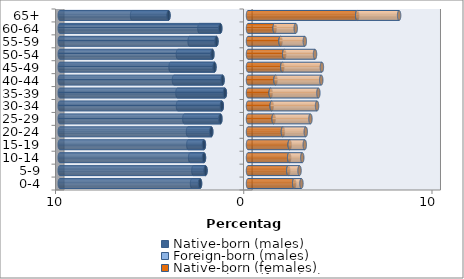
| Category | Native-born (males) | Foreign-born (males) | Native-born (females) | Foreign-born (females) |
|---|---|---|---|---|
| 0-4 | -2.547 | -0.426 | 2.454 | 0.385 |
| 5-9 | -2.257 | -0.645 | 2.139 | 0.597 |
| 10-14 | -2.339 | -0.735 | 2.186 | 0.697 |
| 15-19 | -2.342 | -0.828 | 2.214 | 0.801 |
| 20-24 | -1.952 | -1.236 | 1.855 | 1.214 |
| 25-29 | -1.467 | -1.916 | 1.361 | 1.956 |
| 30-34 | -1.39 | -2.331 | 1.258 | 2.41 |
| 35-39 | -1.228 | -2.52 | 1.205 | 2.534 |
| 40-44 | -1.352 | -2.582 | 1.46 | 2.431 |
| 45-49 | -1.783 | -2.332 | 1.822 | 2.104 |
| 50-54 | -1.892 | -1.833 | 1.924 | 1.637 |
| 55-59 | -1.676 | -1.427 | 1.727 | 1.291 |
| 60-64 | -1.474 | -1.108 | 1.416 | 1.121 |
| 65+ | -4.225 | -1.933 | 5.802 | 2.226 |